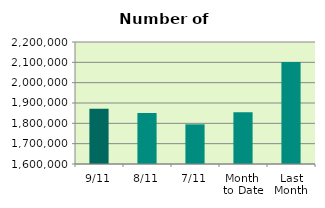
| Category | Series 0 |
|---|---|
| 9/11 | 1871312 |
| 8/11 | 1850958 |
| 7/11 | 1795100 |
| Month 
to Date | 1854334.857 |
| Last
Month | 2101052.87 |